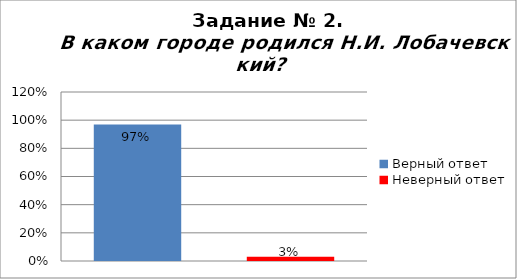
| Category | В каком городе родился Н.И. Лобачевский? |
|---|---|
| Верный ответ | 0.97 |
| Неверный ответ | 0.03 |